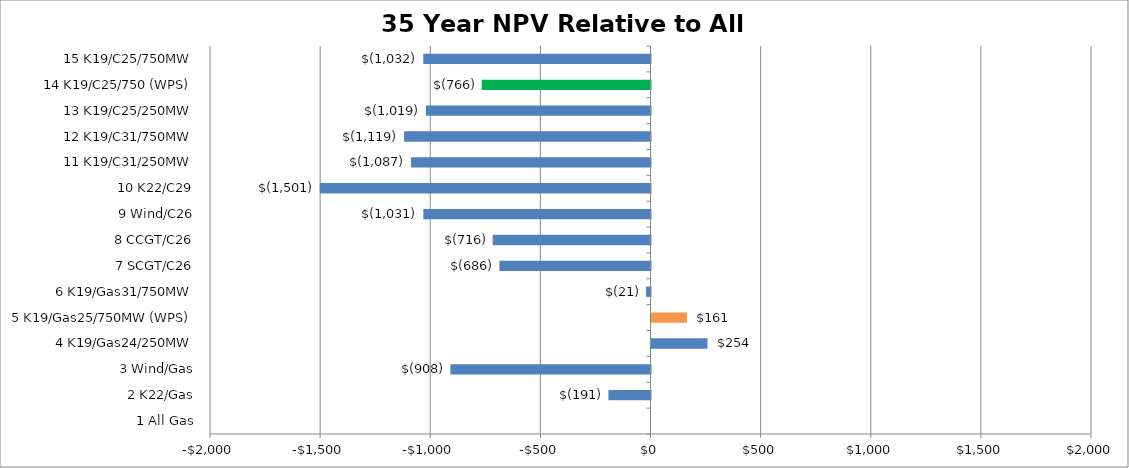
| Category | 35 NPV |
|---|---|
| 1 All Gas | 0 |
| 2 K22/Gas | -190.933 |
| 3 Wind/Gas | -908.419 |
| 4 K19/Gas24/250MW | 254.291 |
| 5 K19/Gas25/750MW (WPS) | 161.083 |
| 6 K19/Gas31/750MW | -20.533 |
| 7 SCGT/C26 | -686.132 |
| 8 CCGT/C26 | -716.412 |
| 9 Wind/C26 | -1031.491 |
| 10 K22/C29 | -1501.418 |
| 11 K19/C31/250MW | -1087.015 |
| 12 K19/C31/750MW | -1118.672 |
| 13 K19/C25/250MW | -1019.348 |
| 14 K19/C25/750 (WPS) | -766.264 |
| 15 K19/C25/750MW | -1031.762 |